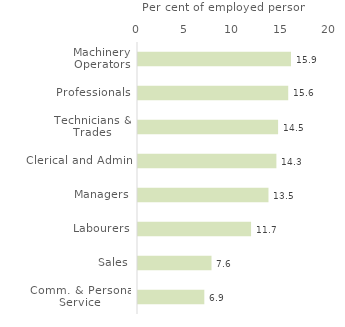
| Category | Series 0 |
|---|---|
| Machinery Operators | 15.852 |
| Professionals | 15.566 |
| Technicians & Trades | 14.517 |
| Clerical and Admin | 14.341 |
| Managers | 13.52 |
| Labourers | 11.716 |
| Sales | 7.616 |
| Comm. & Personal Service | 6.872 |